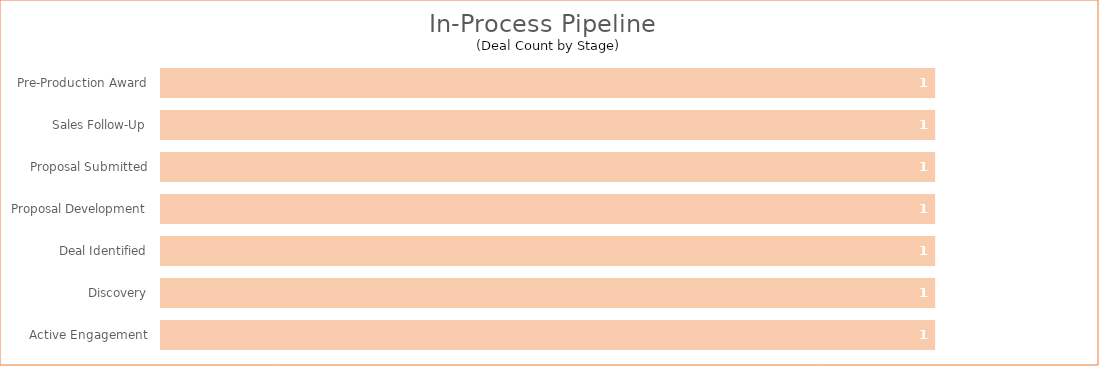
| Category | Series 0 |
|---|---|
| Active Engagement | 1 |
| Discovery | 1 |
| Deal Identified | 1 |
| Proposal Development | 1 |
| Proposal Submitted | 1 |
| Sales Follow-Up | 1 |
| Pre-Production Award | 1 |